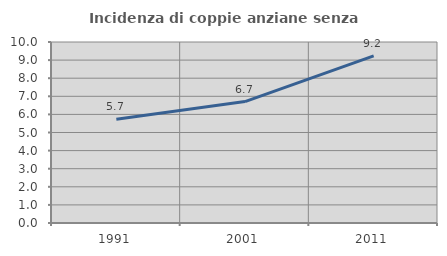
| Category | Incidenza di coppie anziane senza figli  |
|---|---|
| 1991.0 | 5.726 |
| 2001.0 | 6.708 |
| 2011.0 | 9.229 |